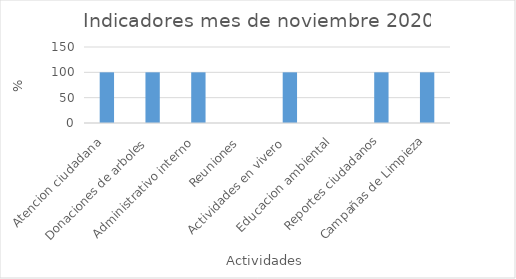
| Category | Series 0 |
|---|---|
| Atencion ciudadana  | 100 |
| Donaciones de arboles  | 100 |
| Administrativo interno  | 100 |
| Reuniones  | 0 |
| Actividades en vivero  | 100 |
| Educacion ambiental  | 0 |
| Reportes ciudadanos | 100 |
| Campañas de Limpieza | 100 |